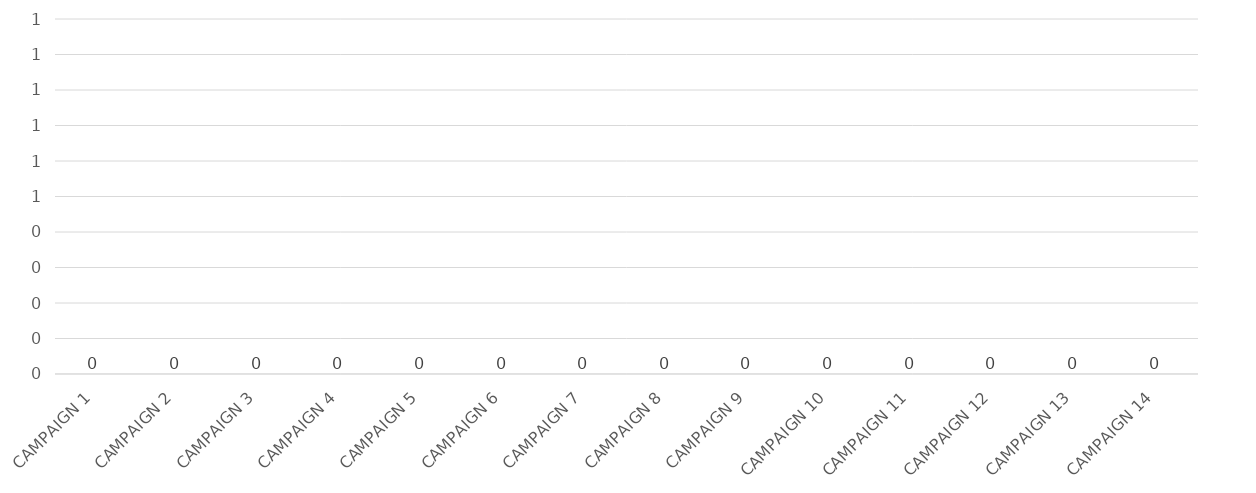
| Category | YTD CLICKS |
|---|---|
| CAMPAIGN 1 | 0 |
| CAMPAIGN 2 | 0 |
| CAMPAIGN 3 | 0 |
| CAMPAIGN 4 | 0 |
| CAMPAIGN 5 | 0 |
| CAMPAIGN 6 | 0 |
| CAMPAIGN 7 | 0 |
| CAMPAIGN 8 | 0 |
| CAMPAIGN 9 | 0 |
| CAMPAIGN 10 | 0 |
| CAMPAIGN 11 | 0 |
| CAMPAIGN 12 | 0 |
| CAMPAIGN 13 | 0 |
| CAMPAIGN 14 | 0 |